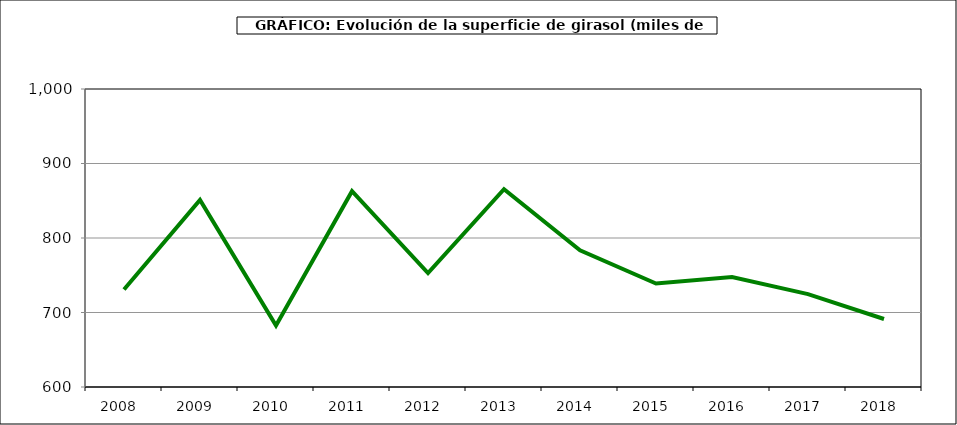
| Category | Superficie |
|---|---|
| 2008.0 | 730.819 |
| 2009.0 | 851.12 |
| 2010.0 | 682.522 |
| 2011.0 | 862.869 |
| 2012.0 | 753.015 |
| 2013.0 | 865.564 |
| 2014.0 | 783.425 |
| 2015.0 | 738.851 |
| 2016.0 | 747.672 |
| 2017.0 | 724.629 |
| 2018.0 | 691.276 |